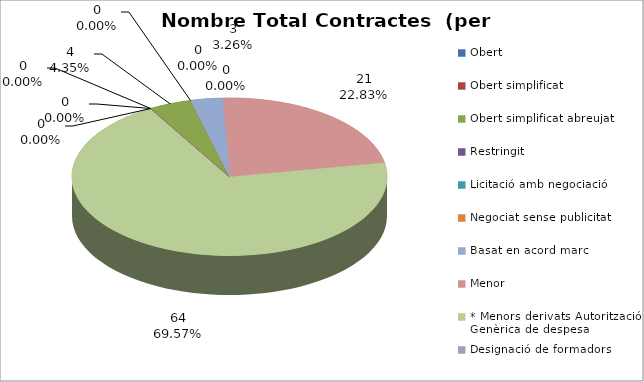
| Category | Nombre Total Contractes |
|---|---|
| Obert | 0 |
| Obert simplificat | 0 |
| Obert simplificat abreujat | 4 |
| Restringit | 0 |
| Licitació amb negociació | 0 |
| Negociat sense publicitat | 0 |
| Basat en acord marc | 3 |
| Menor | 21 |
| * Menors derivats Autorització Genèrica de despesa | 64 |
| Designació de formadors | 0 |